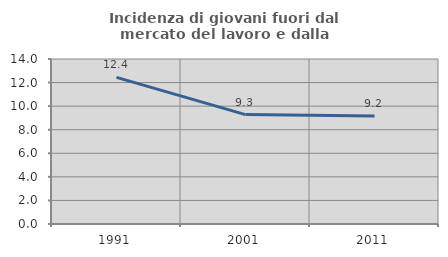
| Category | Incidenza di giovani fuori dal mercato del lavoro e dalla formazione  |
|---|---|
| 1991.0 | 12.442 |
| 2001.0 | 9.283 |
| 2011.0 | 9.167 |